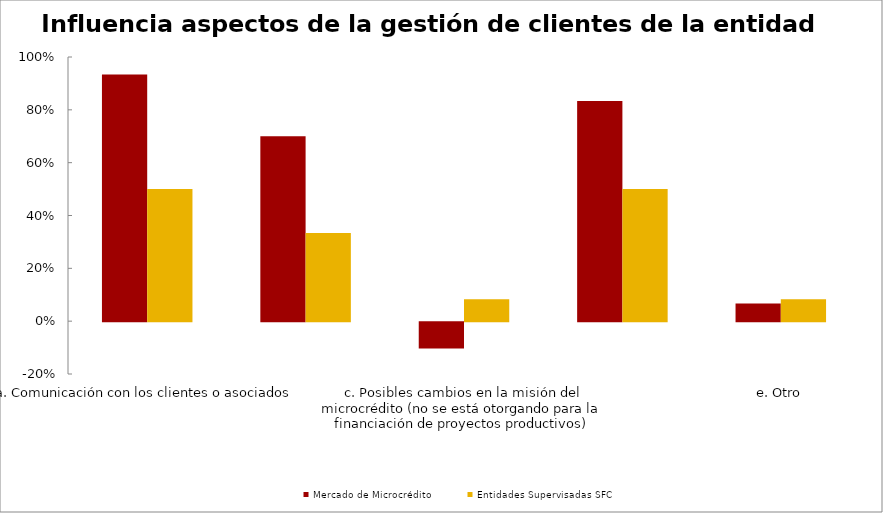
| Category | Mercado de Microcrédito | Entidades Supervisadas SFC |
|---|---|---|
| a. Comunicación con los clientes o asociados | 0.933 | 0.5 |
| b. Desarrollo de productos adecuados para los clientes o asociados | 0.7 | 0.333 |
| c. Posibles cambios en la misión del microcrédito (no se está otorgando para la financiación de proyectos productivos) | -0.1 | 0.083 |
| d. Apoyo del asesor de microcrédito | 0.833 | 0.5 |
| e. Otro | 0.067 | 0.083 |